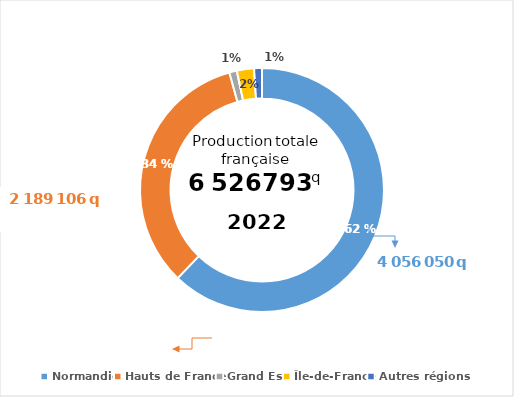
| Category | 2022 |
|---|---|
| Normandie | 4056050 |
| Hauts de France | 2189106 |
| Grand Est | 65455 |
| Île-de-France | 148276 |
| Autres régions | 67906 |